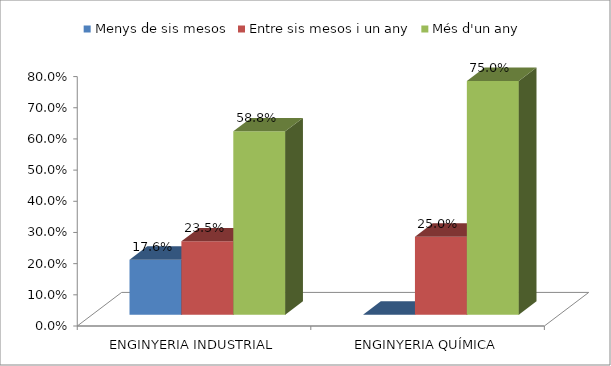
| Category | Menys de sis mesos | Entre sis mesos i un any | Més d'un any |
|---|---|---|---|
| ENGINYERIA INDUSTRIAL | 0.176 | 0.235 | 0.588 |
| ENGINYERIA QUÍMICA | 0 | 0.25 | 0.75 |